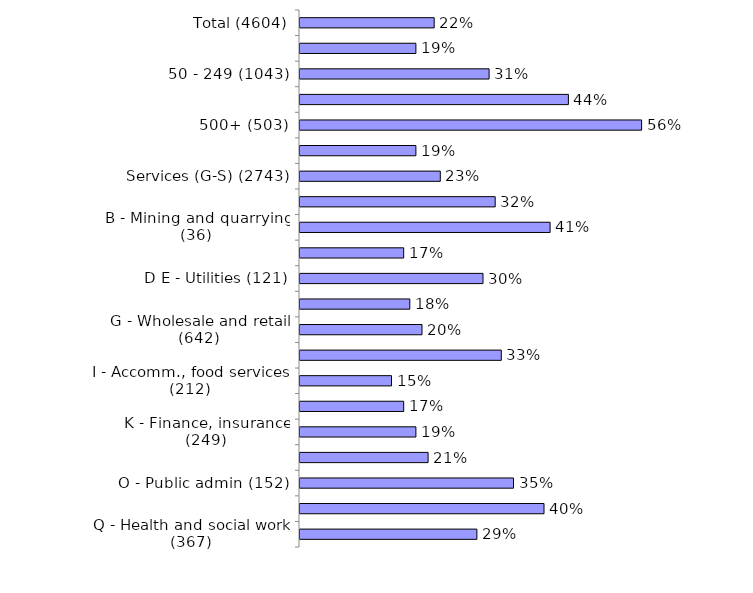
| Category | Series 0 |
|---|---|
| Total (4604) | 0.22 |
| 10-49 (2678) | 0.19 |
| 50 - 249 (1043) | 0.31 |
| 250 - 499 (380) | 0.44 |
| 500+ (503) | 0.56 |
| Production (A-F) (1861) | 0.19 |
| Services (G-S) (2743) | 0.23 |
| A - Agriculture (135) | 0.32 |
| B - Mining and quarrying (36) | 0.41 |
| C - Manufacturing (1396) | 0.17 |
| D E - Utilities (121) | 0.3 |
| F - Construction (173) | 0.18 |
| G - Wholesale and retail (642) | 0.2 |
| H - Transport , storage (203) | 0.33 |
| I - Accomm., food services (212) | 0.15 |
| J - Information, comms (170) | 0.17 |
| K - Finance, insurance (249) | 0.19 |
| LMNRS - Bus/tech/admin/arts/other (366) | 0.21 |
| O - Public admin (152) | 0.35 |
| P - Education (382) | 0.4 |
| Q - Health and social work (367) | 0.29 |